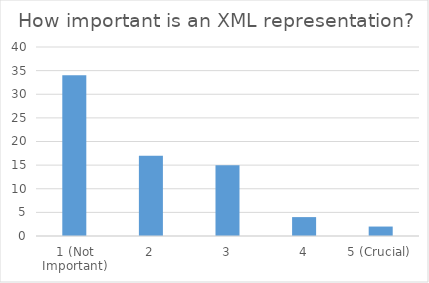
| Category | How important is an XML representation? |
|---|---|
| 1 (Not Important) | 34 |
| 2 | 17 |
| 3 | 15 |
| 4 | 4 |
| 5 (Crucial) | 2 |